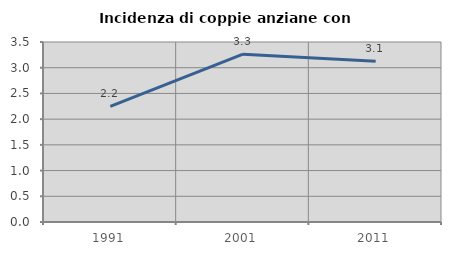
| Category | Incidenza di coppie anziane con figli |
|---|---|
| 1991.0 | 2.249 |
| 2001.0 | 3.263 |
| 2011.0 | 3.125 |